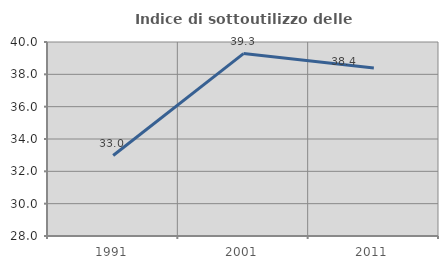
| Category | Indice di sottoutilizzo delle abitazioni  |
|---|---|
| 1991.0 | 32.976 |
| 2001.0 | 39.282 |
| 2011.0 | 38.391 |